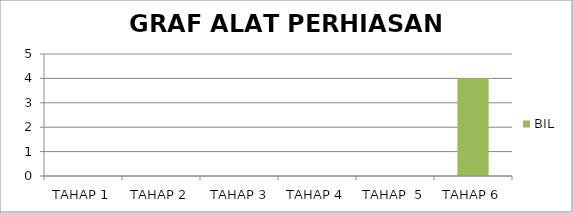
| Category | BIL |
|---|---|
| TAHAP 1 | 0 |
| TAHAP 2 | 0 |
|  TAHAP 3 | 0 |
| TAHAP 4 | 0 |
| TAHAP  5 | 0 |
| TAHAP 6 | 4 |